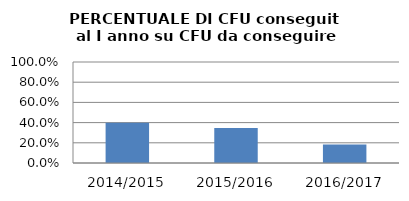
| Category | 2014/2015 2015/2016 2016/2017 |
|---|---|
| 2014/2015 | 0.399 |
| 2015/2016 | 0.347 |
| 2016/2017 | 0.183 |